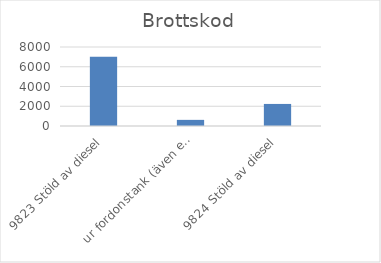
| Category | Summa |
|---|---|
| 9823 Stöld av diesel, ur fordonstank (även entreprenadmaskin m.m.) | 7016 |
| 9824 Stöld av diesel, ur större tankar (ej kopplade till fordon) | 621 |
| 9825 Stöld av drivmedel (även diesel), ej genom smitning | 2234 |